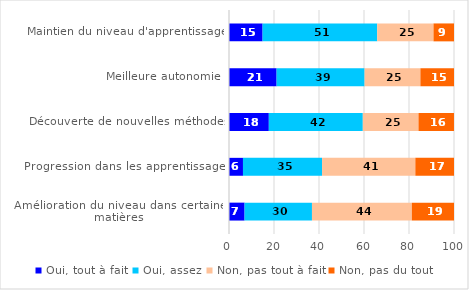
| Category | Oui, tout à fait | Oui, assez | Non, pas tout à fait | Non, pas du tout |
|---|---|---|---|---|
| Maintien du niveau d'apprentissage | 14.93 | 50.93 | 25.03 | 9.11 |
| Meilleure autonomie  | 21.16 | 39.1 | 24.81 | 14.93 |
| Découverte de nouvelles méthodes | 17.7 | 41.77 | 24.75 | 15.77 |
| Progression dans les apprentissages | 6.21 | 35.15 | 41.46 | 17.18 |
| Amélioration du niveau dans certaines matières | 6.92 | 29.95 | 44.39 | 18.74 |